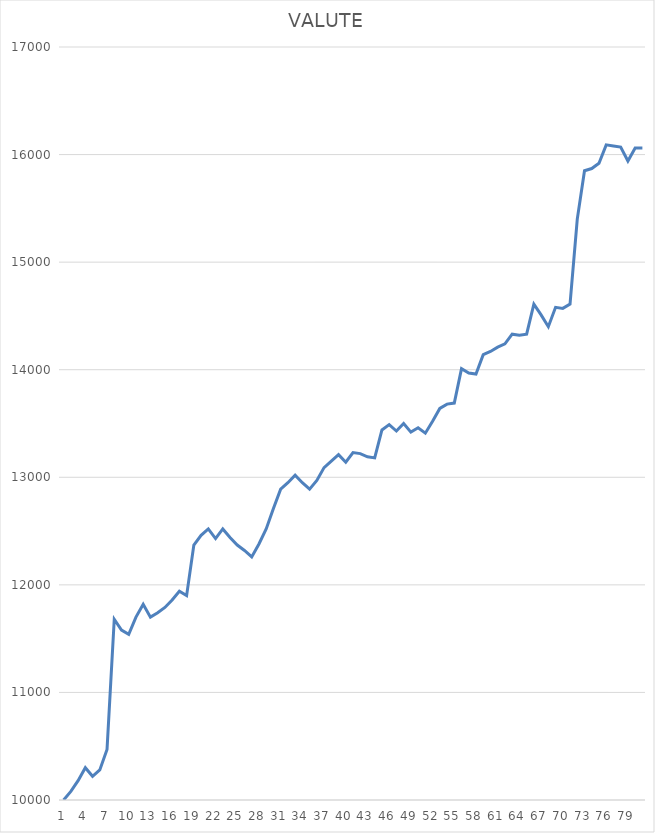
| Category | Series 0 |
|---|---|
| 0 | 10000 |
| 1 | 10080 |
| 2 | 10180 |
| 3 | 10300 |
| 4 | 10220 |
| 5 | 10280 |
| 6 | 10470 |
| 7 | 11680 |
| 8 | 11580 |
| 9 | 11540 |
| 10 | 11700 |
| 11 | 11820 |
| 12 | 11700 |
| 13 | 11740 |
| 14 | 11790 |
| 15 | 11860 |
| 16 | 11940 |
| 17 | 11900 |
| 18 | 12370 |
| 19 | 12460 |
| 20 | 12520 |
| 21 | 12430 |
| 22 | 12520 |
| 23 | 12440 |
| 24 | 12370 |
| 25 | 12320 |
| 26 | 12260 |
| 27 | 12380 |
| 28 | 12520 |
| 29 | 12710 |
| 30 | 12890 |
| 31 | 12950 |
| 32 | 13020 |
| 33 | 12950 |
| 34 | 12890 |
| 35 | 12970 |
| 36 | 13090 |
| 37 | 13150 |
| 38 | 13210 |
| 39 | 13140 |
| 40 | 13230 |
| 41 | 13220 |
| 42 | 13190 |
| 43 | 13180 |
| 44 | 13440 |
| 45 | 13490 |
| 46 | 13430 |
| 47 | 13500 |
| 48 | 13420 |
| 49 | 13460 |
| 50 | 13410 |
| 51 | 13520 |
| 52 | 13640 |
| 53 | 13680 |
| 54 | 13690 |
| 55 | 14010 |
| 56 | 13970 |
| 57 | 13960 |
| 58 | 14140 |
| 59 | 14170 |
| 60 | 14210 |
| 61 | 14240 |
| 62 | 14330 |
| 63 | 14320 |
| 64 | 14330 |
| 65 | 14610 |
| 66 | 14510 |
| 67 | 14400 |
| 68 | 14580 |
| 69 | 14570 |
| 70 | 14610 |
| 71 | 15400 |
| 72 | 15850 |
| 73 | 15870 |
| 74 | 15920 |
| 75 | 16090 |
| 76 | 16080 |
| 77 | 16070 |
| 78 | 15940 |
| 79 | 16060 |
| 80 | 16060 |